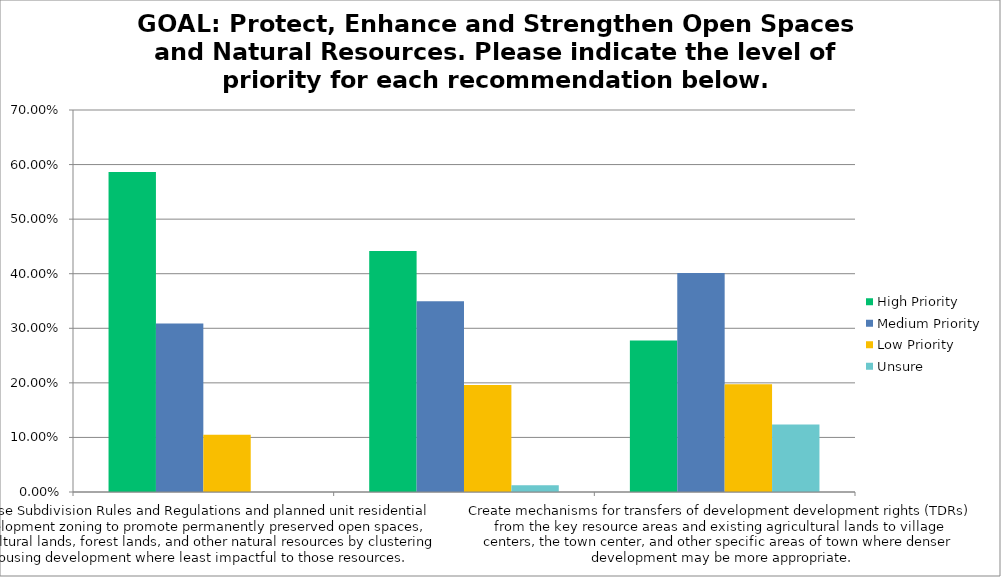
| Category | High Priority | Medium Priority | Low Priority | Unsure |
|---|---|---|---|---|
| Revise Subdivision Rules and Regulations and planned unit residential development zoning to promote permanently preserved open spaces, agricultural lands, forest lands, and other natural resources by clustering housing development where least impactful to  | 0.586 | 0.309 | 0.105 | 0 |
| Investigate protection of scenic roads and roadway trees through passage of the Scenic Roads Act. | 0.442 | 0.35 | 0.196 | 0.012 |
| Create mechanisms for transfers of development development rights (TDRs) from the key resource areas and existing agricultural lands to village centers, the town center, and other specific areas of town where denser development may be more appropriate. | 0.278 | 0.401 | 0.198 | 0.124 |